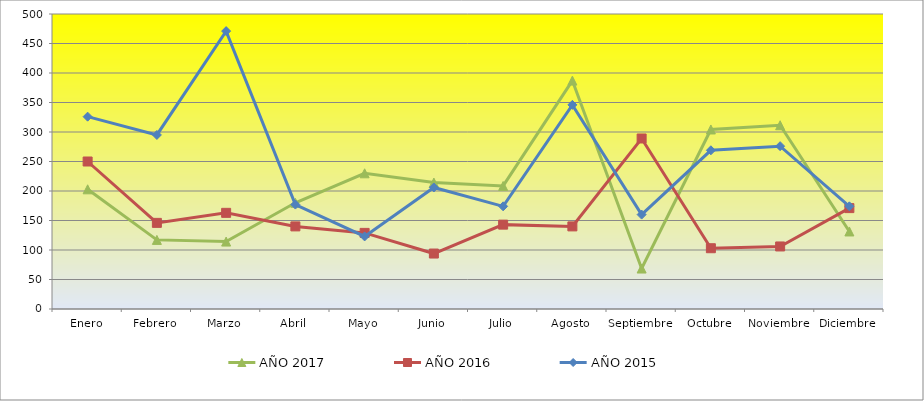
| Category | AÑO 2017 | AÑO 2016 | AÑO 2015 |
|---|---|---|---|
| Enero | 202.857 | 250 | 326 |
| Febrero | 117.143 | 146 | 295 |
| Marzo | 114.286 | 163 | 471 |
| Abril | 180 | 140 | 177 |
| Mayo | 230 | 129 | 123 |
| Junio | 214.286 | 94 | 206 |
| Julio | 208.571 | 143 | 174 |
| Agosto | 387.143 | 140 | 346 |
| Septiembre | 68.571 | 289 | 160 |
| Octubre | 304.286 | 103 | 269 |
| Noviembre | 311.429 | 106 | 276 |
| Diciembre | 131.429 | 171 | 174 |